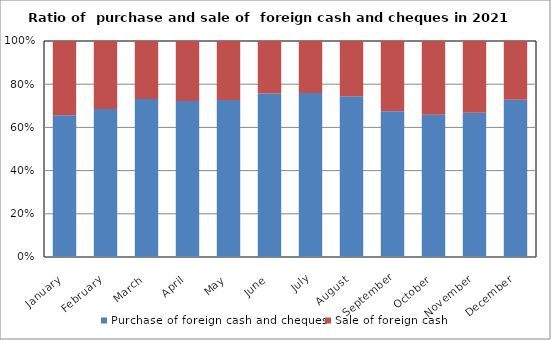
| Category | Purchase of foreign cash and cheques | Sale of foreign cash  |
|---|---|---|
| January | 664769760 | 348171034 |
| February | 751521200 | 344928997 |
| March | 1055898276 | 386485301 |
| April | 1020513501 | 392819589 |
| May | 1232236651 | 461787954 |
| June | 1686655339 | 540146321 |
| July | 2754000360 | 872731702 |
| August | 3156066953 | 1083812301 |
| September | 1735118728 | 836370634 |
| October | 1183494590 | 612024383 |
| November | 1072746101 | 532250018 |
| December | 1738583794 | 649164297 |